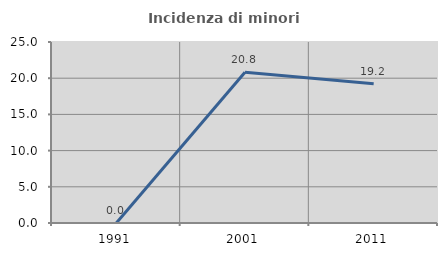
| Category | Incidenza di minori stranieri |
|---|---|
| 1991.0 | 0 |
| 2001.0 | 20.833 |
| 2011.0 | 19.231 |